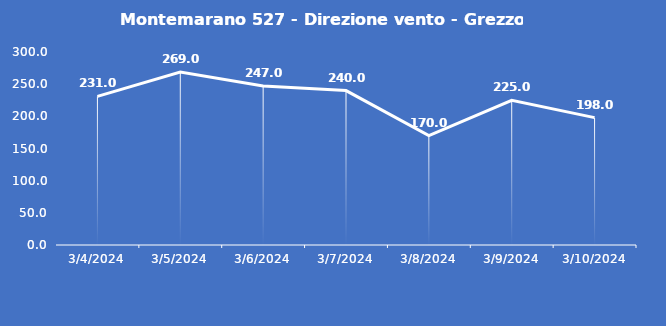
| Category | Montemarano 527 - Direzione vento - Grezzo (°N) |
|---|---|
| 3/4/24 | 231 |
| 3/5/24 | 269 |
| 3/6/24 | 247 |
| 3/7/24 | 240 |
| 3/8/24 | 170 |
| 3/9/24 | 225 |
| 3/10/24 | 198 |